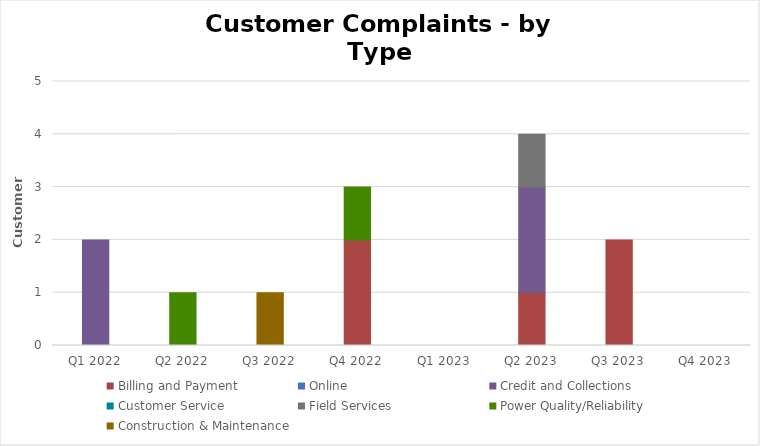
| Category | Billing and Payment | Online | Credit and Collections | Customer Service | Field Services | Power Quality/Reliability | Construction & Maintenance |
|---|---|---|---|---|---|---|---|
| Q1 2022 | 0 | 0 | 2 | 0 | 0 | 0 | 0 |
| Q2 2022 | 0 | 0 | 0 | 0 | 0 | 1 | 0 |
| Q3 2022 | 0 | 0 | 0 | 0 | 0 | 0 | 1 |
| Q4 2022 | 2 | 0 | 0 | 0 | 0 | 1 | 0 |
| Q1 2023 | 0 | 0 | 0 | 0 | 0 | 0 | 0 |
| Q2 2023 | 1 | 0 | 2 | 0 | 1 | 0 | 0 |
| Q3 2023 | 2 | 0 | 0 | 0 | 0 | 0 | 0 |
| Q4 2023 | 0 | 0 | 0 | 0 | 0 | 0 | 0 |